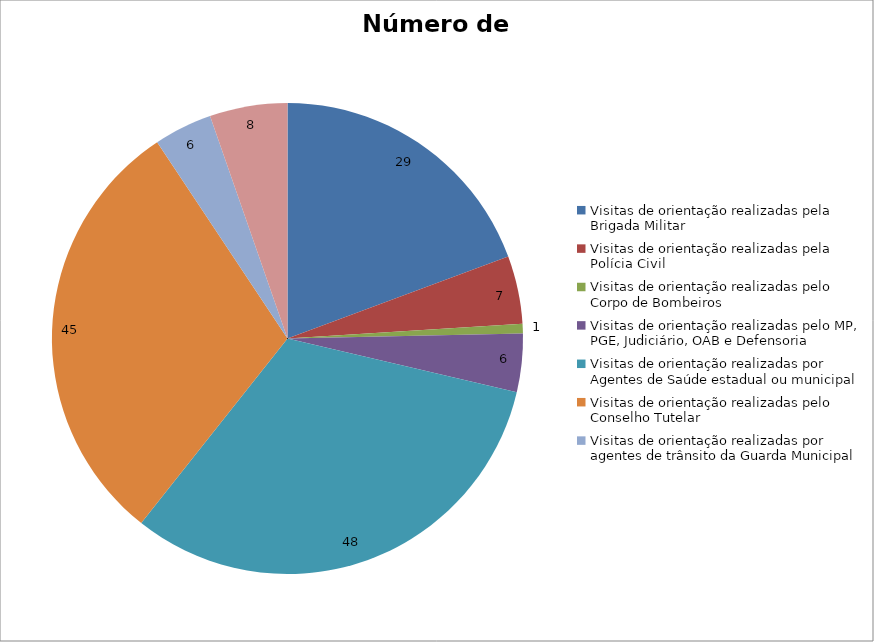
| Category | Número de Ações |
|---|---|
| Visitas de orientação realizadas pela Brigada Militar | 29 |
| Visitas de orientação realizadas pela Polícia Civil | 7 |
| Visitas de orientação realizadas pelo Corpo de Bombeiros | 1 |
| Visitas de orientação realizadas pelo MP, PGE, Judiciário, OAB e Defensoria | 6 |
| Visitas de orientação realizadas por Agentes de Saúde estadual ou municipal | 48 |
| Visitas de orientação realizadas pelo Conselho Tutelar | 45 |
| Visitas de orientação realizadas por agentes de trânsito da Guarda Municipal | 6 |
| Visitas de orientação realizadas por ONGs, entidades privadas, CRAS e CREAS | 8 |